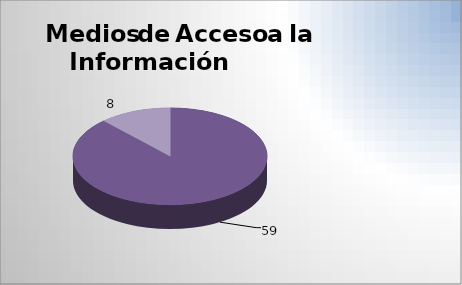
| Category | Series 0 |
|---|---|
| Consulta directa electrónica | 59 |
| Combinación de las anteriores (consulta directa personal y electrónica, reproducción de documentos, elaboración de informes específicos.) | 8 |